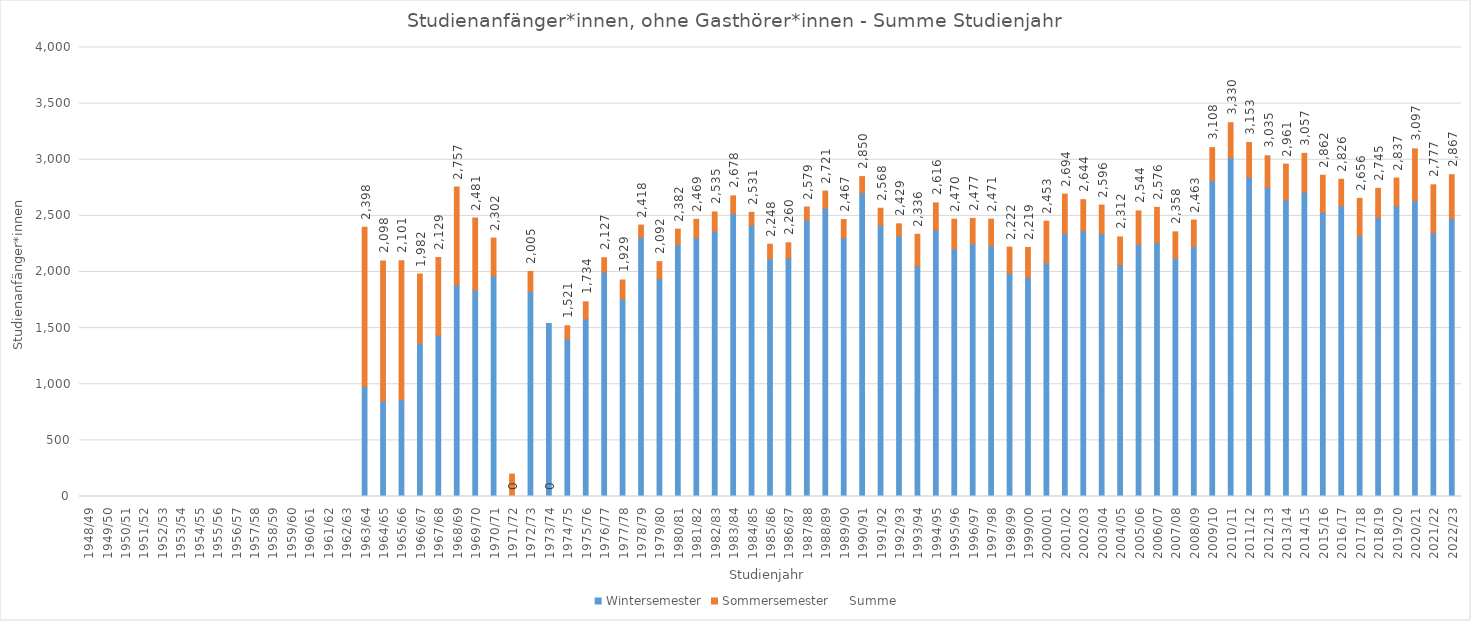
| Category | Wintersemester | Sommersemester |
|---|---|---|
| 1948/49 | 0 | 0 |
| 1949/50 | 0 | 0 |
| 1950/51 | 0 | 0 |
| 1951/52 | 0 | 0 |
| 1952/53 | 0 | 0 |
| 1953/54 | 0 | 0 |
| 1954/55 | 0 | 0 |
| 1955/56 | 0 | 0 |
| 1956/57 | 0 | 0 |
| 1957/58 | 0 | 0 |
| 1958/59 | 0 | 0 |
| 1959/60 | 0 | 0 |
| 1960/61 | 0 | 0 |
| 1961/62 | 0 | 0 |
| 1962/63 | 0 | 0 |
| 1963/64 | 979 | 1419 |
| 1964/65 | 848 | 1250 |
| 1965/66 | 862 | 1239 |
| 1966/67 | 1364 | 618 |
| 1967/68 | 1437 | 692 |
| 1968/69 | 1887 | 870 |
| 1969/70 | 1840 | 641 |
| 1970/71 | 1966 | 336 |
| 1971/72 | 0 | 200 |
| 1972/73 | 1827 | 178 |
| 1973/74 | 1541 | 0 |
| 1974/75 | 1404 | 117 |
| 1975/76 | 1581 | 153 |
| 1976/77 | 1999 | 128 |
| 1977/78 | 1758 | 171 |
| 1978/79 | 2310 | 108 |
| 1979/80 | 1940 | 152 |
| 1980/81 | 2244 | 138 |
| 1981/82 | 2306 | 163 |
| 1982/83 | 2363 | 172 |
| 1983/84 | 2519 | 159 |
| 1984/85 | 2415 | 116 |
| 1985/86 | 2119 | 129 |
| 1986/87 | 2126 | 134 |
| 1987/88 | 2461 | 118 |
| 1988/89 | 2568 | 153 |
| 1989/90 | 2304 | 163 |
| 1990/91 | 2707 | 143 |
| 1991/92 | 2416 | 152 |
| 1992/93 | 2322 | 107 |
| 1993/94 | 2053 | 283 |
| 1994/95 | 2373 | 243 |
| 1995/96 | 2206 | 264 |
| 1996/97 | 2251 | 226 |
| 1997/98 | 2234 | 237 |
| 1998/99 | 1988 | 234 |
| 1999/00 | 1954 | 265 |
| 2000/01 | 2081 | 372 |
| 2001/02 | 2342 | 352 |
| 2002/03 | 2367 | 277 |
| 2003/04 | 2343 | 253 |
| 2004/05 | 2066 | 246 |
| 2005/06 | 2246 | 298 |
| 2006/07 | 2263 | 313 |
| 2007/08 | 2122 | 236 |
| 2008/09 | 2229 | 234 |
| 2009/10 | 2814 | 294 |
| 2010/11 | 3018 | 312 |
| 2011/12 | 2844 | 309 |
| 2012/13 | 2754 | 281 |
| 2013/14 | 2642 | 319 |
| 2014/15 | 2713 | 344 |
| 2015/16 | 2532 | 330 |
| 2016/17 | 2589 | 237 |
| 2017/18 | 2322 | 334 |
| 2018/19 | 2487 | 258 |
| 2019/20 | 2589 | 248 |
| 2020/21 | 2635 | 462 |
| 2021/22 | 2351 | 426 |
| 2022/23 | 2474 | 393 |